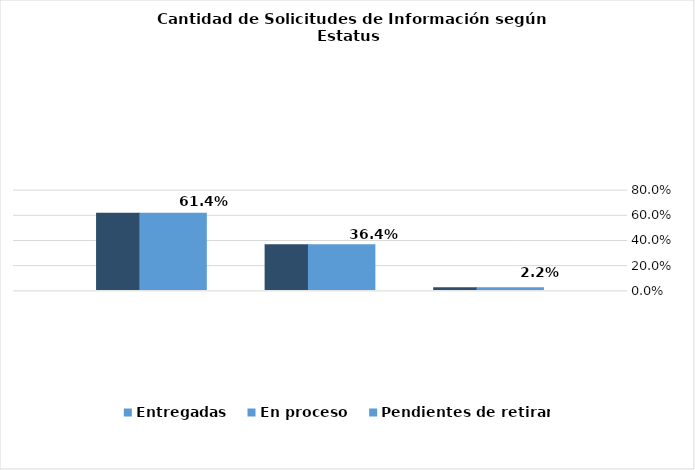
| Category | Entregadas | En proceso | Pendientes de retirar |
|---|---|---|---|
|  | 0.614 | 0.364 | 0.022 |